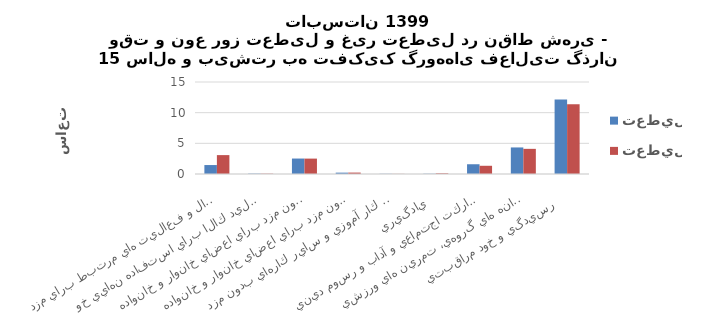
| Category | تعطيل | غير تعطيل |
|---|---|---|
| اشتغال و فعاليت هاي مرتبط براي مزد  | 1.46 | 3.08 |
| توليد كالا براي استفاده نهايي خود   | 0.06 | 0.05 |
| خدمات خانگي بدون مزد براي اعضاي خانوار و خانواده   | 2.52 | 2.51 |
| خدمات مراقبتي بدون مزد براي اعضاي خانوار و خانواده   | 0.22 | 0.23 |
| كارداوطلبانه بدون مزد، كار آموزي و ساير كارهاي بدون مزد  | 0.03 | 0.02 |
| يادگيري  | 0.04 | 0.11 |
| معاشرت، ارتباط، مشاركت اجتماعي و آداب و رسوم ديني  | 1.59 | 1.34 |
| فرهنگ، فراغت، رسانه هاي گروهي، تمرين هاي ورزشي  | 4.33 | 4.1 |
| رسيدگي و خود مراقبتي   | 12.14 | 11.37 |